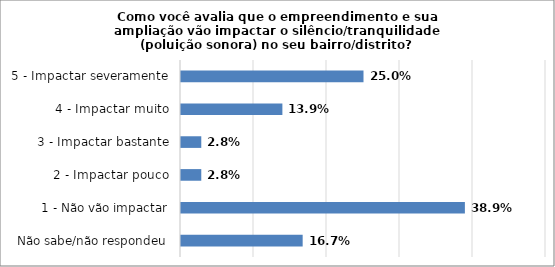
| Category | Series 0 |
|---|---|
| Não sabe/não respondeu | 0.167 |
| 1 - Não vão impactar | 0.389 |
| 2 - Impactar pouco | 0.028 |
| 3 - Impactar bastante | 0.028 |
| 4 - Impactar muito | 0.139 |
| 5 - Impactar severamente | 0.25 |